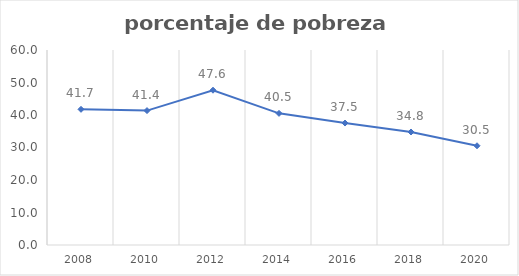
| Category | Series 0 |
|---|---|
| 2008.0 | 41.746 |
| 2010.0 | 41.357 |
| 2012.0 | 47.625 |
| 2014.0 | 40.503 |
| 2016.0 | 37.526 |
| 2018.0 | 34.77 |
| 2020.0 | 30.536 |